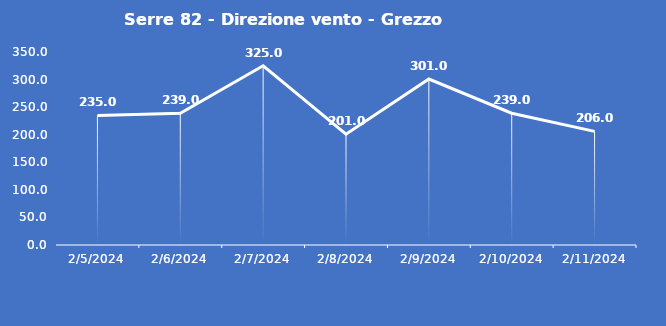
| Category | Serre 82 - Direzione vento - Grezzo (°N) |
|---|---|
| 2/5/24 | 235 |
| 2/6/24 | 239 |
| 2/7/24 | 325 |
| 2/8/24 | 201 |
| 2/9/24 | 301 |
| 2/10/24 | 239 |
| 2/11/24 | 206 |